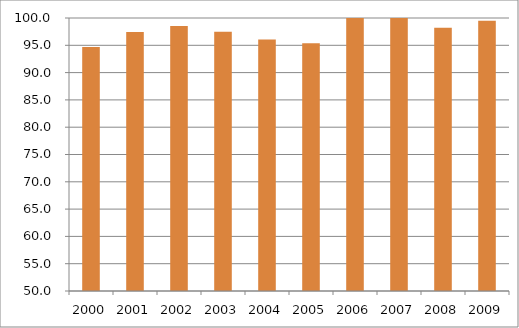
| Category | Brasil |
|---|---|
| 2000.0 | 94.71 |
| 2001.0 | 97.45 |
| 2002.0 | 98.55 |
| 2003.0 | 97.47 |
| 2004.0 | 96.05 |
| 2005.0 | 95.37 |
| 2006.0 | 100.49 |
| 2007.0 | 103.06 |
| 2008.0 | 98.21 |
| 2009.0 | 99.5 |